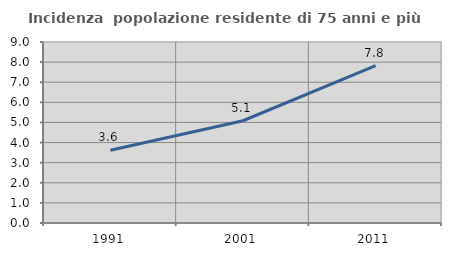
| Category | Incidenza  popolazione residente di 75 anni e più |
|---|---|
| 1991.0 | 3.617 |
| 2001.0 | 5.084 |
| 2011.0 | 7.825 |